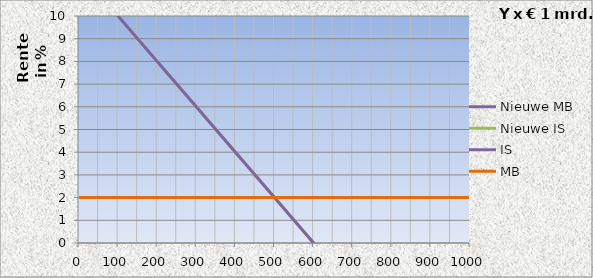
| Category | Nieuwe MB | Nieuwe IS | IS | MB |
|---|---|---|---|---|
| 0.0 | 2 | 12 | 12 | 2 |
| 100.0 | 2 | 10 | 10 | 2 |
| 200.0 | 2 | 8 | 8 | 2 |
| 300.0 | 2 | 6 | 6 | 2 |
| 400.0 | 2 | 4 | 4 | 2 |
| 500.0 | 2 | 2 | 2 | 2 |
| 600.0 | 2 | 0 | 0 | 2 |
| 700.0 | 2 | -2 | -2 | 2 |
| 800.0 | 2 | -4 | -4 | 2 |
| 900.0 | 2 | -6 | -6 | 2 |
| 1000.0 | 2 | -8 | -8 | 2 |